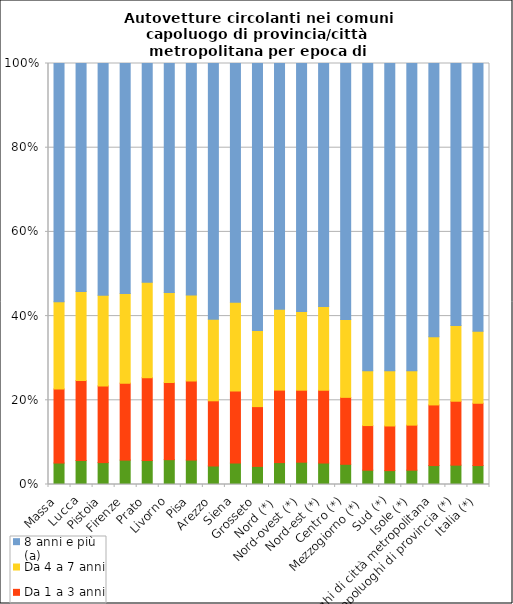
| Category | Meno di 1 anno | Da 1 a 3 anni | Da 4 a 7 anni | 8 anni e più (a) |
|---|---|---|---|---|
| Massa | 5.1 | 17.6 | 20.7 | 56.6 |
| Lucca | 5.7 | 19 | 21.2 | 54.2 |
| Pistoia | 5.2 | 18.2 | 21.5 | 55 |
| Firenze | 5.8 | 18.3 | 21.3 | 54.7 |
| Prato | 5.7 | 19.7 | 22.7 | 52 |
| Livorno | 5.9 | 18.3 | 21.4 | 54.4 |
| Pisa | 5.8 | 18.8 | 20.4 | 55 |
| Arezzo | 4.4 | 15.5 | 19.4 | 60.8 |
| Siena | 5.1 | 17.1 | 21.1 | 56.7 |
| Grosseto | 4.3 | 14.2 | 18.1 | 63.4 |
| Nord (*)  | 5.2 | 17.2 | 19.2 | 58.3 |
| Nord-ovest (*) | 5.3 | 17.1 | 18.7 | 58.9 |
| Nord-est (*) | 5.1 | 17.3 | 19.9 | 57.7 |
| Centro (*) | 4.8 | 15.9 | 18.5 | 60.8 |
| Mezzogiorno (*)  | 3.4 | 10.6 | 13 | 73 |
| Sud (*) | 3.3 | 10.6 | 13.1 | 73 |
| Isole (*) | 3.4 | 10.7 | 12.9 | 73 |
| Capoluoghi di città metropolitana | 4.5 | 14.4 | 16.2 | 64.9 |
| Capoluoghi di provincia (*) | 4.6 | 15.2 | 18 | 62.3 |
| Italia (*) | 4.5 | 14.8 | 17.1 | 63.6 |